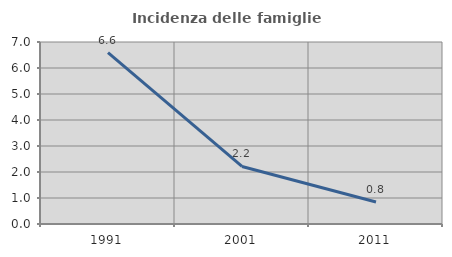
| Category | Incidenza delle famiglie numerose |
|---|---|
| 1991.0 | 6.593 |
| 2001.0 | 2.214 |
| 2011.0 | 0.844 |